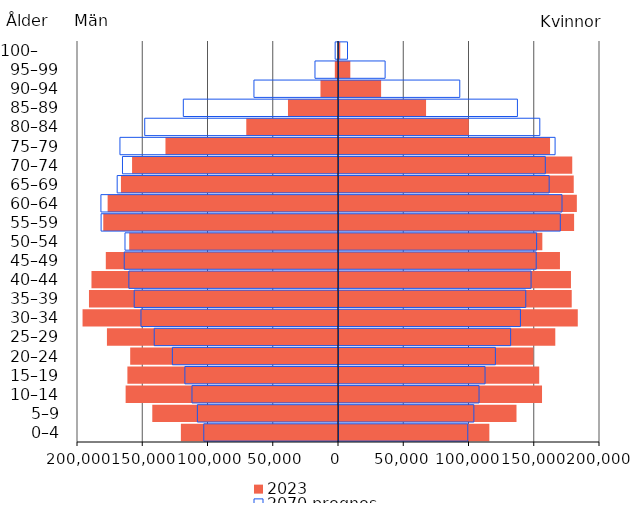
| Category | 2023 | 2070 prognos |
|---|---|---|
| 0–4 | 115211 | 98675 |
| 5–9 | 136012 | 103340 |
| 10–14 | 155573 | 107315 |
| 15–19 | 153424 | 111910 |
| 20–24 | 148987 | 119832 |
| 25–29 | 165738 | 131518 |
| 30–34 | 182972 | 139035 |
| 35–39 | 178335 | 143112 |
| 40–44 | 177751 | 147183 |
| 45–49 | 169327 | 151106 |
| 50–54 | 155810 | 151443 |
| 55–59 | 180155 | 169578 |
| 60–64 | 182260 | 170887 |
| 65–69 | 179869 | 161040 |
| 70–74 | 178732 | 158084 |
| 75–79 | 161722 | 165589 |
| 80–84 | 99450 | 153874 |
| 85–89 | 66715 | 136731 |
| 90–94 | 32267 | 92552 |
| 95–99 | 8664 | 35341 |
| 100–     | 979 | 6515 |